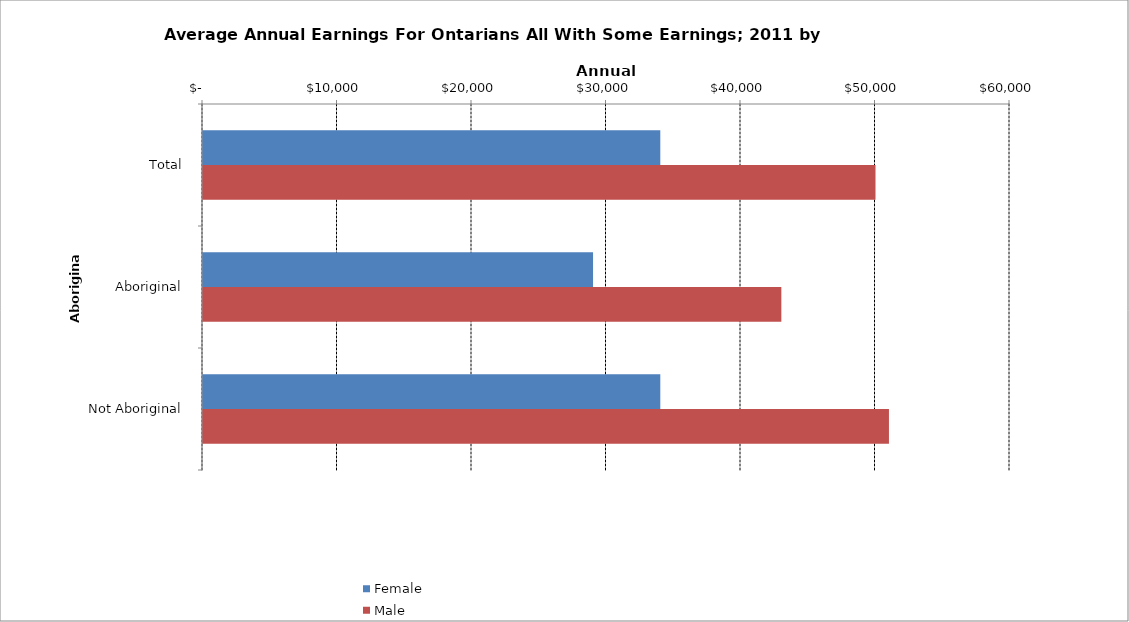
| Category | Female | Male |
|---|---|---|
| Total | 34000 | 50000 |
|  Aboriginal  | 29000 | 43000 |
|  Not Aboriginal  | 34000 | 51000 |